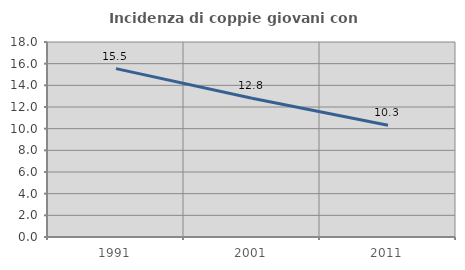
| Category | Incidenza di coppie giovani con figli |
|---|---|
| 1991.0 | 15.544 |
| 2001.0 | 12.812 |
| 2011.0 | 10.311 |